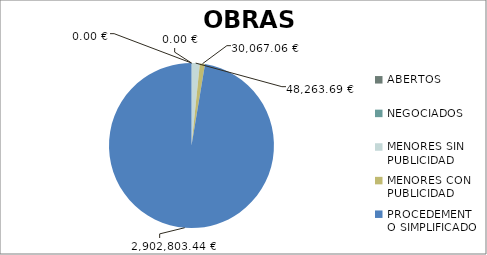
| Category | Series 0 |
|---|---|
| ABERTOS  | 0 |
| NEGOCIADOS  | 0 |
| MENORES SIN PUBLICIDAD | 48263.69 |
| MENORES CON PUBLICIDAD | 30067.06 |
| PROCEDEMENTO SIMPLIFICADO | 2902803.44 |